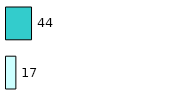
| Category | Series 0 | Series 1 |
|---|---|---|
| 0 | 17 | 44 |